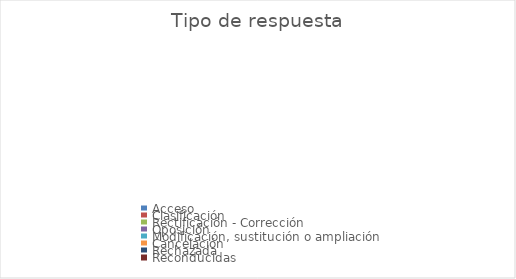
| Category | Series 0 |
|---|---|
| Acceso | 0 |
| Clasificación | 0 |
| Rectificación - Corrección | 0 |
| Oposición | 0 |
| Modificación, sustitución o ampliación | 0 |
| Cancelación | 0 |
| Rechazada | 0 |
| Reconducidas | 0 |